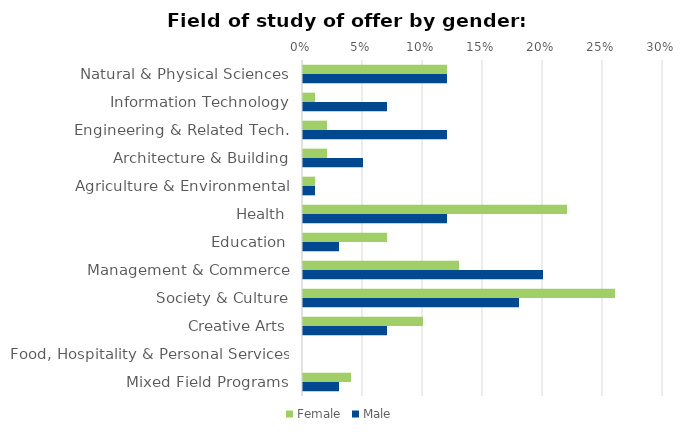
| Category | Female | Male |
|---|---|---|
| Natural & Physical Sciences | 0.12 | 0.12 |
| Information Technology | 0.01 | 0.07 |
| Engineering & Related Tech. | 0.02 | 0.12 |
| Architecture & Building | 0.02 | 0.05 |
| Agriculture & Environmental | 0.01 | 0.01 |
| Health | 0.22 | 0.12 |
| Education | 0.07 | 0.03 |
| Management & Commerce | 0.13 | 0.2 |
| Society & Culture | 0.26 | 0.18 |
| Creative Arts | 0.1 | 0.07 |
| Food, Hospitality & Personal Services | 0 | 0 |
| Mixed Field Programs | 0.04 | 0.03 |